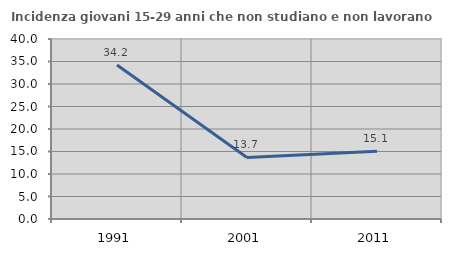
| Category | Incidenza giovani 15-29 anni che non studiano e non lavorano  |
|---|---|
| 1991.0 | 34.224 |
| 2001.0 | 13.675 |
| 2011.0 | 15.057 |